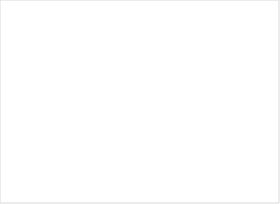
| Category | Series 0 |
|---|---|
| Not in place | 0 |
| Partially met | 0 |
| Fully met | 0 |
| N/A | 0 |